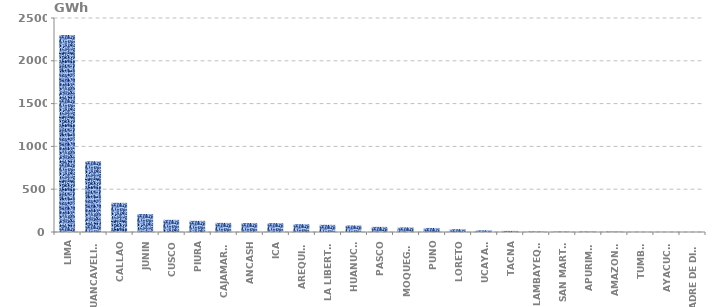
| Category | Series 0 |
|---|---|
| LIMA | 2300.557 |
| HUANCAVELICA | 826.61 |
| CALLAO | 340.974 |
| JUNIN | 210.489 |
| CUSCO | 142.15 |
| PIURA | 130.543 |
| CAJAMARCA | 106.574 |
| ANCASH | 104.613 |
| ICA | 103.635 |
| AREQUIPA | 91.219 |
| LA LIBERTAD | 83.826 |
| HUANUCO | 76.193 |
| PASCO | 59.782 |
| MOQUEGUA | 53.623 |
| PUNO | 47.187 |
| LORETO | 32.971 |
| UCAYALI | 19.822 |
| TACNA | 12.783 |
| LAMBAYEQUE | 5.24 |
| SAN MARTÍN | 4.418 |
| APURIMAC | 4.297 |
| AMAZONAS | 3.975 |
| TUMBES | 1.101 |
| AYACUCHO | 0.792 |
| MADRE DE DIOS | 0.12 |